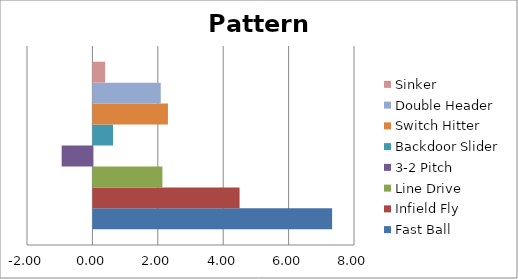
| Category | Fast Ball | Infield Fly | Line Drive | 3-2 Pitch | Backdoor Slider | Switch Hitter | Double Header | Sinker |
|---|---|---|---|---|---|---|---|---|
| 0 | 7.3 | 4.47 | 2.11 | -0.94 | 0.6 | 2.28 | 2.06 | 0.36 |